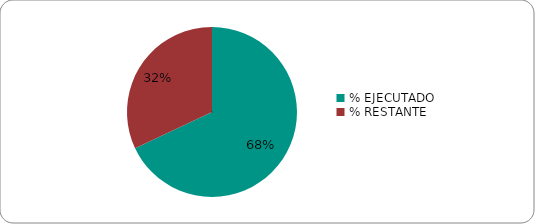
| Category | Series 0 |
|---|---|
| % EJECUTADO | 0.68 |
| % RESTANTE | 0.32 |